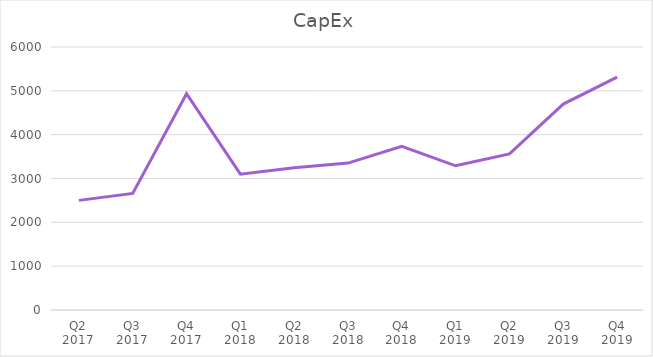
| Category | Series 0 |
|---|---|
| Q2 2017 | 2501 |
| Q3 2017 | 2659 |
| Q4 2017 | 4934 |
| Q1 2018 | 3098 |
| Q2 2018 | 3243 |
| Q3 2018 | 3352 |
| Q4 2018 | 3734 |
| Q1 2019 | 3290 |
| Q2 2019 | 3562 |
| Q3 2019 | 4697 |
| Q4 2019 | 5312 |